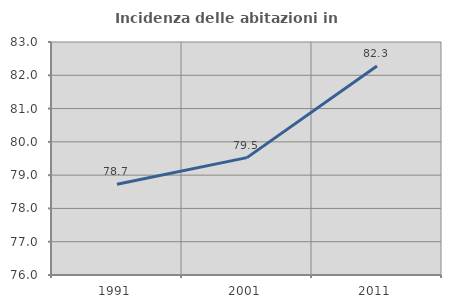
| Category | Incidenza delle abitazioni in proprietà  |
|---|---|
| 1991.0 | 78.728 |
| 2001.0 | 79.527 |
| 2011.0 | 82.276 |